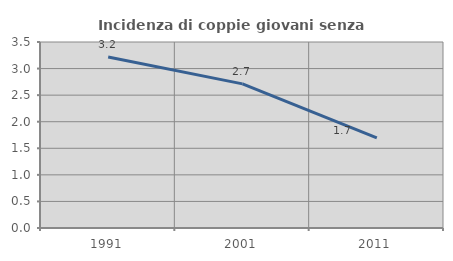
| Category | Incidenza di coppie giovani senza figli |
|---|---|
| 1991.0 | 3.219 |
| 2001.0 | 2.712 |
| 2011.0 | 1.695 |